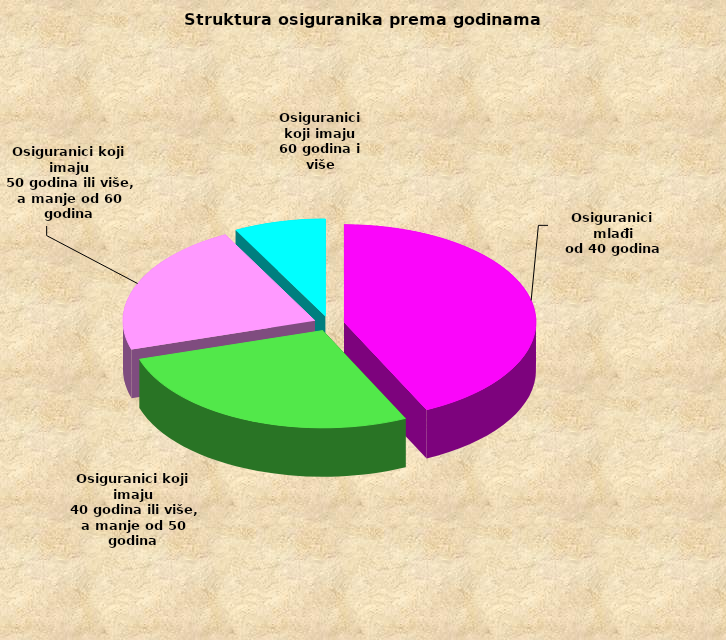
| Category | Series 0 |
|---|---|
| Osiguranici mlađi
od 40 godina | 693906 |
| Osiguranici koji imaju
 40 godina ili više, a manje od 50 godina | 441615 |
| Osiguranici koji imaju
 50 godina ili više, a manje od 60 godina | 356435 |
| Osiguranici koji imaju
60 godina i više | 125050 |